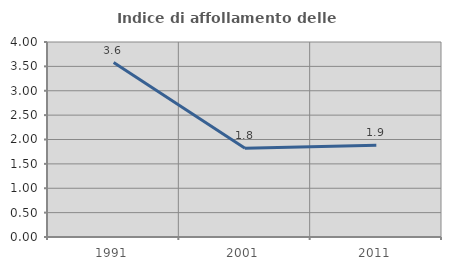
| Category | Indice di affollamento delle abitazioni  |
|---|---|
| 1991.0 | 3.579 |
| 2001.0 | 1.823 |
| 2011.0 | 1.884 |